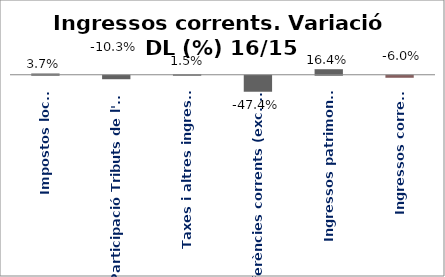
| Category | Series 0 |
|---|---|
| Impostos locals | 0.037 |
| Participació Tributs de l'Estat | -0.103 |
| Taxes i altres ingressos | 0.015 |
| Transferències corrents (exc. FCF) | -0.474 |
| Ingressos patrimonials | 0.164 |
| Ingressos corrents | -0.06 |